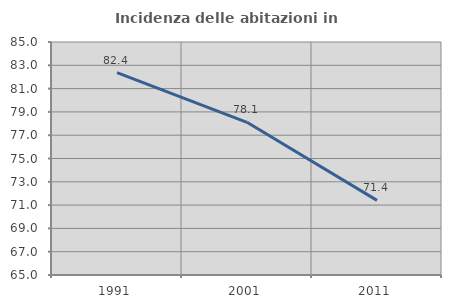
| Category | Incidenza delle abitazioni in proprietà  |
|---|---|
| 1991.0 | 82.372 |
| 2001.0 | 78.108 |
| 2011.0 | 71.405 |